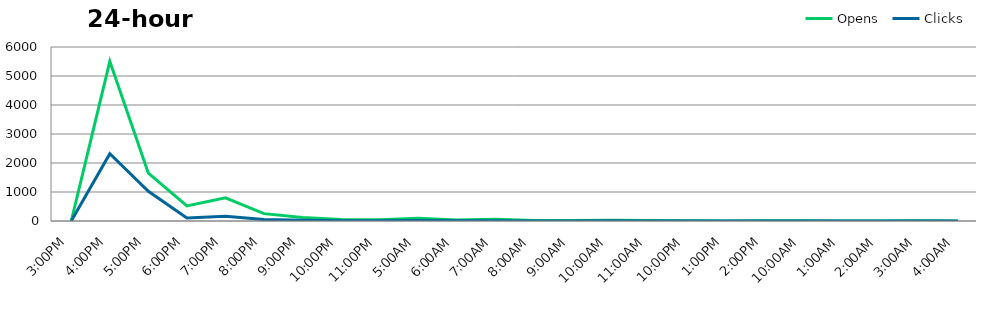
| Category | Opens | Clicks |
|---|---|---|
| 0.625 | 0 | 0 |
| 0.6666666666666666 | 5506 | 2321 |
| 0.7083333333333334 | 1651 | 1023 |
| 0.75 | 520 | 104 |
| 0.7916666666666666 | 800 | 160 |
| 0.8333333333333334 | 254 | 50.8 |
| 0.875 | 121 | 24.2 |
| 0.9166666666666666 | 53 | 10.6 |
| 0.9583333333333334 | 44 | 8.8 |
| 0.20833333333333334 | 92 | 18.4 |
| 0.25 | 33 | 6.6 |
| 0.2916666666666667 | 62 | 12.4 |
| 0.3333333333333333 | 13 | 2.6 |
| 0.375 | 15 | 3 |
| 0.4166666666666667 | 22 | 4.4 |
| 0.4583333333333333 | 14 | 2.8 |
| 0.5 | 6 | 1.2 |
| 0.5416666666666666 | 2 | 0.4 |
| 0.5833333333333334 | 5 | 1 |
| 0.0 | 7 | 1.4 |
| 0.041666666666666664 | 2 | 0.4 |
| 0.08333333333333333 | 3 | 0.6 |
| 0.125 | 5 | 1 |
| 0.16666666666666666 | 0 | 0 |